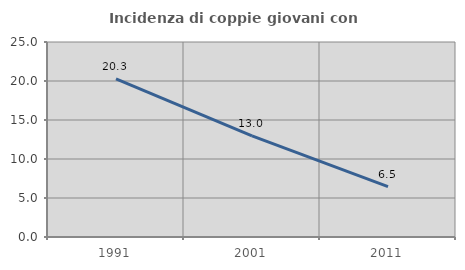
| Category | Incidenza di coppie giovani con figli |
|---|---|
| 1991.0 | 20.286 |
| 2001.0 | 12.963 |
| 2011.0 | 6.457 |